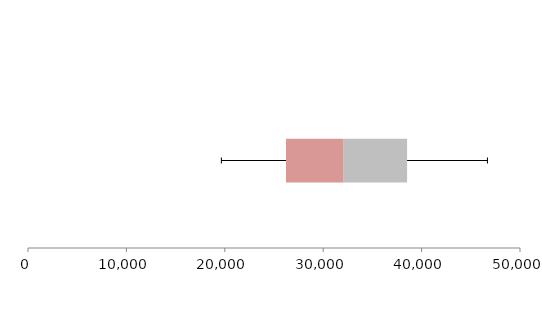
| Category | Series 1 | Series 2 | Series 3 |
|---|---|---|---|
| 0 | 26222.413 | 5854.793 | 6446.668 |